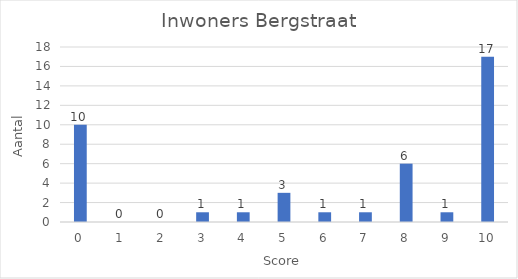
| Category | Aantal |
|---|---|
| 0.0 | 10 |
| 1.0 | 0 |
| 2.0 | 0 |
| 3.0 | 1 |
| 4.0 | 1 |
| 5.0 | 3 |
| 6.0 | 1 |
| 7.0 | 1 |
| 8.0 | 6 |
| 9.0 | 1 |
| 10.0 | 17 |